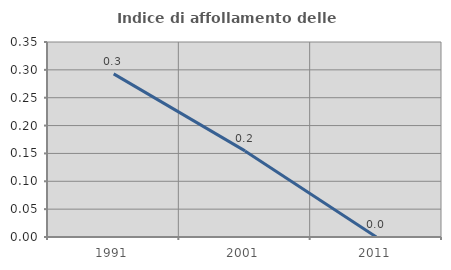
| Category | Indice di affollamento delle abitazioni  |
|---|---|
| 1991.0 | 0.293 |
| 2001.0 | 0.155 |
| 2011.0 | 0 |